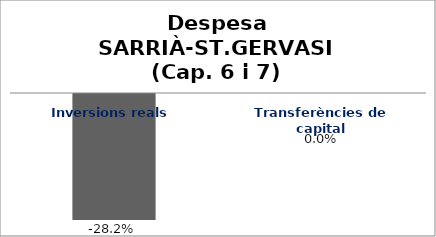
| Category | Series 0 |
|---|---|
| Inversions reals | -0.282 |
| Transferències de capital | 0 |